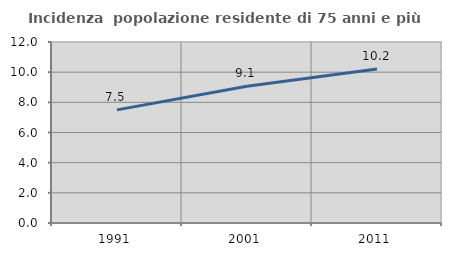
| Category | Incidenza  popolazione residente di 75 anni e più |
|---|---|
| 1991.0 | 7.499 |
| 2001.0 | 9.069 |
| 2011.0 | 10.212 |